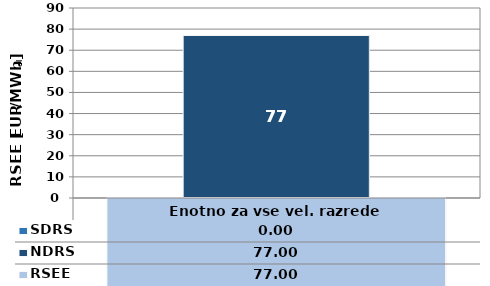
| Category | NDRS | SDRS |
|---|---|---|
| 0 | 77 | 0 |